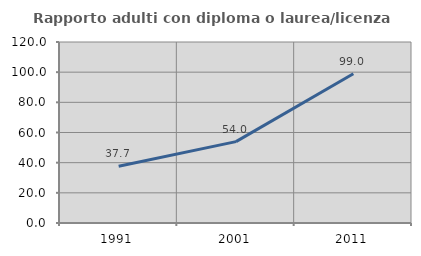
| Category | Rapporto adulti con diploma o laurea/licenza media  |
|---|---|
| 1991.0 | 37.665 |
| 2001.0 | 53.958 |
| 2011.0 | 98.969 |